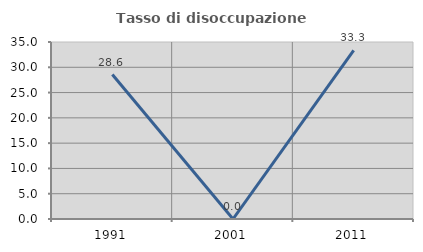
| Category | Tasso di disoccupazione giovanile  |
|---|---|
| 1991.0 | 28.571 |
| 2001.0 | 0 |
| 2011.0 | 33.333 |